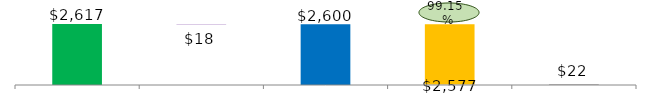
| Category | Flotante | Serie Graf |
|---|---|---|
| Reservas Constituidas | 0 | 2617.202 |
| Anulaciones | 2599.63 | 17.572 |
| Reservas Definitivas | 0 | 2599.63 |
| Autorización de Giro | 22.17 | 2577.46 |
| Reservas sin Autorización de Giro | 0 | 22.17 |